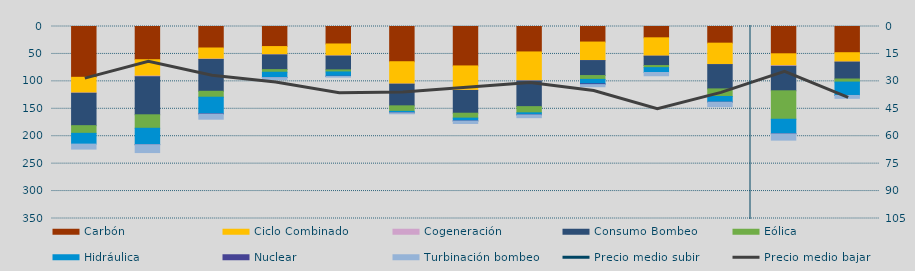
| Category | Carbón | Ciclo Combinado | Cogeneración | Consumo Bombeo | Eólica | Hidráulica | Nuclear | Turbinación bombeo |
|---|---|---|---|---|---|---|---|---|
| F | 92635.5 | 28594.2 | 463.1 | 59071.9 | 13978.3 | 19654.8 | 0 | 9063.5 |
| M | 60556.8 | 29853.7 | 1006.6 | 69541.7 | 24572.7 | 29936.2 | 30 | 14315.8 |
| A | 39185.7 | 20218.6 | 667 | 58045.1 | 10784.5 | 30176.3 | 635.3 | 9263.7 |
| M | 36573.1 | 14965.8 | 259.5 | 26811.1 | 4780.9 | 9611.3 | 138 | 3683.8 |
| J | 31856.5 | 21784.2 | 332.6 | 25120.8 | 3742.7 | 7869.8 | 320 | 1244.9 |
| J | 64224.4 | 40730.5 | 223.6 | 39459.7 | 10048.7 | 2606.4 | 130 | 1680.4 |
| A | 71875.8 | 44407.8 | 356.8 | 41443.4 | 8916.4 | 5181.1 | 179.2 | 4517 |
| S | 46377.5 | 52485.1 | 420.2 | 46799.1 | 11262.5 | 3698.4 | 178.3 | 4969.7 |
| O | 28352.7 | 33701.8 | 72.5 | 27285.6 | 6968.9 | 8057.2 | 1524.1 | 3817.1 |
| N | 20637.7 | 33409.3 | 40.8 | 17072.8 | 3847.5 | 8820.4 | 0 | 5932.4 |
| D | 30371.3 | 38818.7 | 239.5 | 44331.3 | 13873.3 | 10280.7 | 108.3 | 8046.3 |
| E | 49749 | 21689 | 1091.7 | 44705.2 | 51833.3 | 26560.6 | 159.6 | 11348.4 |
| F | 47780.9 | 17066.1 | 83.8 | 30784 | 5603.4 | 24359.1 | 40 | 5220.7 |